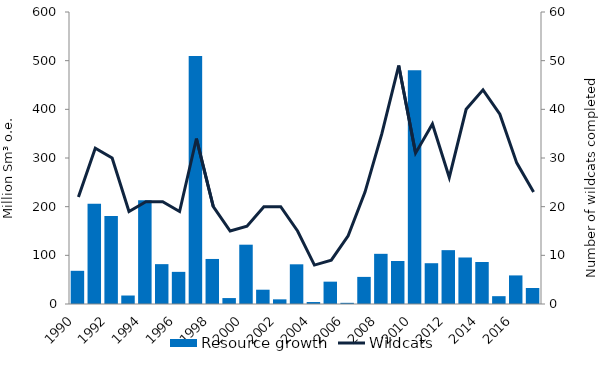
| Category | Resource growth |
|---|---|
| 1990.0 | 68.193 |
| 1991.0 | 205.969 |
| 1992.0 | 180.934 |
| 1993.0 | 17.433 |
| 1994.0 | 213.078 |
| 1995.0 | 81.89 |
| 1996.0 | 66.046 |
| 1997.0 | 509.387 |
| 1998.0 | 92.552 |
| 1999.0 | 12.186 |
| 2000.0 | 121.873 |
| 2001.0 | 29.368 |
| 2002.0 | 9.572 |
| 2003.0 | 81.565 |
| 2004.0 | 4.041 |
| 2005.0 | 45.912 |
| 2006.0 | 2.416 |
| 2007.0 | 55.693 |
| 2008.0 | 103.11 |
| 2009.0 | 88.39 |
| 2010.0 | 480.123 |
| 2011.0 | 83.799 |
| 2012.0 | 110.639 |
| 2013.0 | 95.56 |
| 2014.0 | 86.291 |
| 2015.0 | 16.076 |
| 2016.0 | 58.751 |
| 2017.0 | 32.836 |